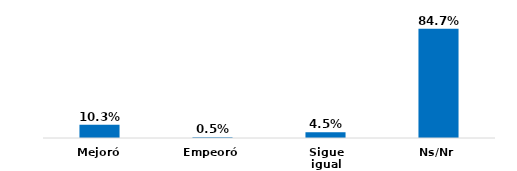
| Category | Series 0 |
|---|---|
| Mejoró | 0.103 |
| Empeoró | 0.005 |
| Sigue igual | 0.045 |
| Ns/Nr | 0.847 |